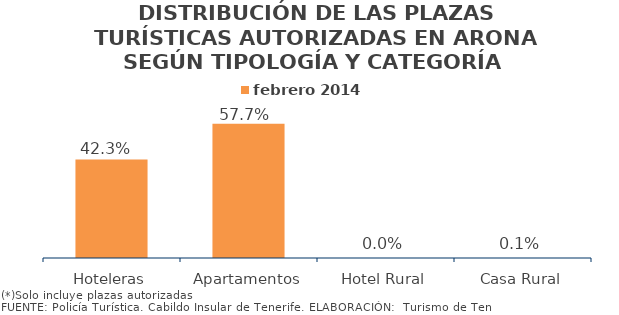
| Category | febrero 2014 |
|---|---|
| Hoteleras | 0.423 |
| Apartamentos | 0.577 |
| Hotel Rural | 0 |
| Casa Rural | 0.001 |